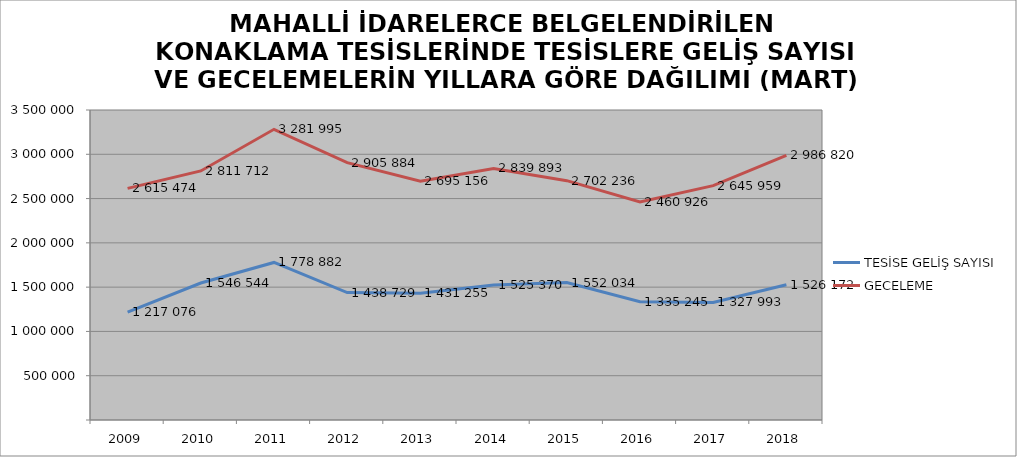
| Category | TESİSE GELİŞ SAYISI | GECELEME |
|---|---|---|
| 2009 | 1217076 | 2615474 |
| 2010 | 1546544 | 2811712 |
| 2011 | 1778882 | 3281995 |
| 2012 | 1438729 | 2905884 |
| 2013 | 1431255 | 2695156 |
| 2014 | 1525370 | 2839893 |
| 2015 | 1552034 | 2702236 |
| 2016 | 1335245 | 2460926 |
| 2017 | 1327993 | 2645959 |
| 2018 | 1526172 | 2986820 |